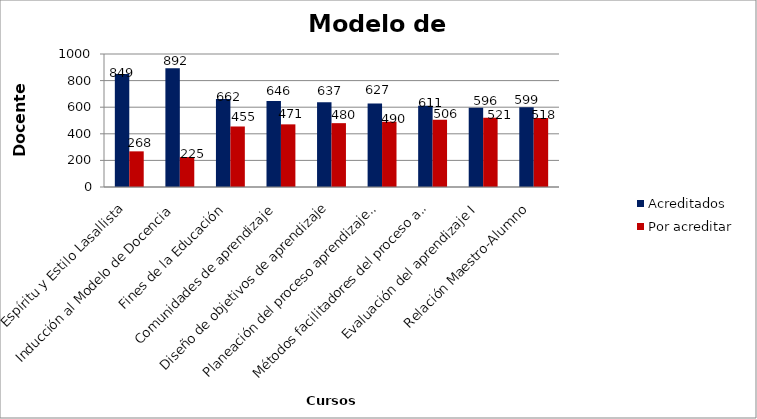
| Category | Acreditados | Por acreditar |
|---|---|---|
| Espíritu y Estilo Lasallista | 849 | 268 |
| Inducción al Modelo de Docencia | 892 | 225 |
| Fines de la Educación | 662 | 455 |
| Comunidades de aprendizaje | 646 | 471 |
| Diseño de objetivos de aprendizaje | 637 | 480 |
| Planeación del proceso aprendizaje-enseñanza I | 627 | 490 |
| Métodos facilitadores del proceso aprendizaje - enseñanza I | 611 | 506 |
| Evaluación del aprendizaje I | 596 | 521 |
| Relación Maestro-Alumno | 599 | 518 |